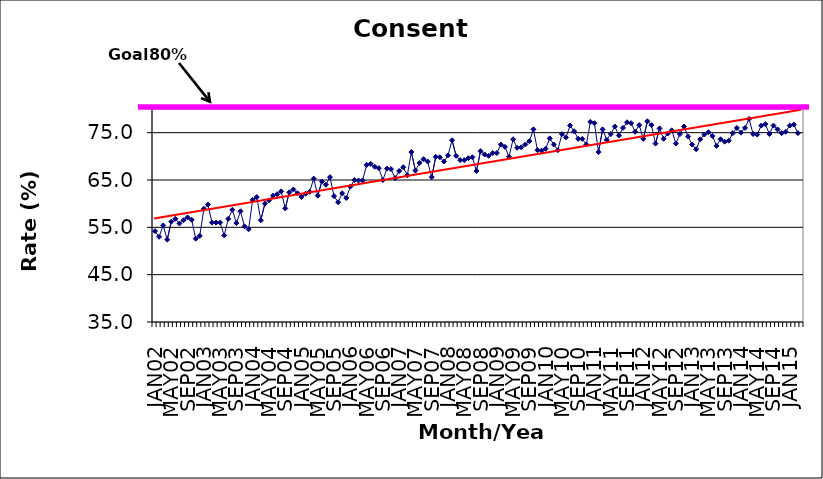
| Category | Series 0 |
|---|---|
| JAN02 | 54.2 |
| FEB02 | 53 |
| MAR02 | 55.4 |
| APR02 | 52.4 |
| MAY02 | 56.2 |
| JUN02 | 56.8 |
| JUL02 | 55.8 |
| AUG02 | 56.5 |
| SEP02 | 57.1 |
| OCT02 | 56.6 |
| NOV02 | 52.6 |
| DEC02 | 53.2 |
| JAN03 | 58.9 |
| FEB03 | 59.8 |
| MAR03 | 56 |
| APR03 | 56 |
| MAY03 | 56 |
| JUN03 | 53.3 |
| JUL03 | 56.8 |
| AUG03 | 58.7 |
| SEP03 | 55.9 |
| OCT03 | 58.4 |
| NOV03 | 55.2 |
| DEC03 | 54.6 |
| JAN04 | 60.8 |
| FEB04 | 61.4 |
| MAR04 | 56.5 |
| APR04 | 60 |
| MAY04 | 60.7 |
| JUN04 | 61.7 |
| JUL04 | 62 |
| AUG04 | 62.6 |
| SEP04 | 59 |
| OCT04 | 62.4 |
| NOV04 | 63 |
| DEC04 | 62.2 |
| JAN05 | 61.4 |
| FEB05 | 62.1 |
| MAR05 | 62.5 |
| APR05 | 65.3 |
| MAY05 | 61.7 |
| JUN05 | 64.7 |
| JUL05 | 64 |
| AUG05 | 65.6 |
| SEP05 | 61.6 |
| OCT05 | 60.3 |
| NOV05 | 62.2 |
| DEC05 | 61.2 |
| JAN06 | 63.6 |
| FEB06 | 65 |
| MAR06 | 64.9 |
| APR06 | 64.9 |
| MAY06 | 68.2 |
| JUN06 | 68.4 |
| JUL06 | 67.8 |
| AUG06 | 67.5 |
| SEP06 | 65 |
| OCT06 | 67.4 |
| NOV06 | 67.3 |
| DEC06 | 65.4 |
| JAN07 | 66.9 |
| FEB07 | 67.7 |
| MAR07 | 66 |
| APR07 | 70.9 |
| MAY07 | 67 |
| JUN07 | 68.6 |
| JUL07 | 69.4 |
| AUG07 | 68.9 |
| SEP07 | 65.6 |
| OCT07 | 69.9 |
| NOV07 | 69.8 |
| DEC07 | 68.9 |
| JAN08 | 70.2 |
| FEB08 | 73.4 |
| MAR08 | 70.1 |
| APR08 | 69.2 |
| MAY08 | 69.2 |
| JUN08 | 69.6 |
| JUL08 | 69.8 |
| AUG08 | 66.9 |
| SEP08 | 71.1 |
| OCT08 | 70.4 |
| NOV08 | 70.1 |
| DEC08 | 70.7 |
| JAN09 | 70.7 |
| FEB09 | 72.5 |
| MAR09 | 72 |
| APR09 | 69.9 |
| MAY09 | 73.6 |
| JUN09 | 71.8 |
| JUL09 | 71.9 |
| AUG09 | 72.5 |
| SEP09 | 73.2 |
| OCT09 | 75.7 |
| NOV09 | 71.3 |
| DEC09 | 71.2 |
| JAN10 | 71.6 |
| FEB10 | 73.8 |
| MAR10 | 72.5 |
| APR10 | 71.3 |
| MAY10 | 74.7 |
| JUN10 | 74 |
| JUL10 | 76.5 |
| AUG10 | 75.3 |
| SEP10 | 73.7 |
| OCT10 | 73.7 |
| NOV10 | 72.5 |
| DEC10 | 77.3 |
| JAN11 | 77 |
| FEB11 | 70.9 |
| MAR11 | 75.7 |
| APR11 | 73.5 |
| MAY11 | 74.7 |
| JUN11 | 76.3 |
| JUL11 | 74.4 |
| AUG11 | 76 |
| SEP11 | 77.2 |
| OCT11 | 77 |
| NOV11 | 75.2 |
| DEC11 | 76.6 |
| JAN12 | 73.7 |
| FEB12 | 77.4 |
| MAR12 | 76.6 |
| APR12 | 72.7 |
| MAY12 | 75.9 |
| JUN12 | 73.7 |
| JUL12 | 74.8 |
| AUG12 | 75.5 |
| SEP12 | 72.7 |
| OCT12 | 74.7 |
| NOV12 | 76.3 |
| DEC12 | 74.2 |
| JAN13 | 72.5 |
| FEB13 | 71.5 |
| MAR13 | 73.6 |
| APR13 | 74.6 |
| MAY13 | 75.1 |
| JUN13 | 74.3 |
| JUL13 | 72.2 |
| AUG13 | 73.6 |
| SEP13 | 73.1 |
| OCT13 | 73.3 |
| NOV13 | 74.9 |
| DEC13 | 76 |
| JAN14 | 75 |
| FEB14 | 76 |
| MAR14 | 77.9 |
| APR14 | 74.7 |
| MAY14 | 74.6 |
| JUN14 | 76.5 |
| JUL14 | 76.8 |
| AUG14 | 74.7 |
| SEP14 | 76.5 |
| OCT14 | 75.7 |
| NOV14 | 74.9 |
| DEC14 | 75.2 |
| JAN15 | 76.5 |
| FEB15 | 76.7 |
| MAR15 | 74.9 |